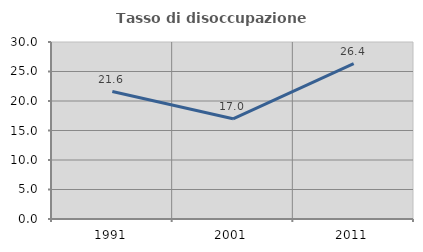
| Category | Tasso di disoccupazione giovanile  |
|---|---|
| 1991.0 | 21.6 |
| 2001.0 | 16.981 |
| 2011.0 | 26.354 |